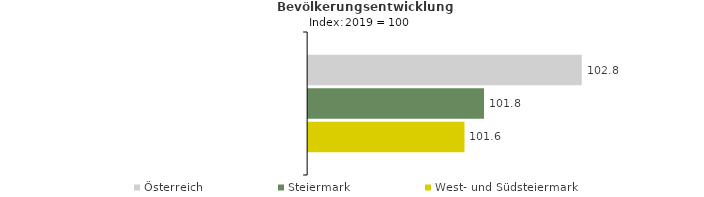
| Category | Österreich | Steiermark | West- und Südsteiermark |
|---|---|---|---|
| 2023.0 | 102.8 | 101.8 | 101.6 |